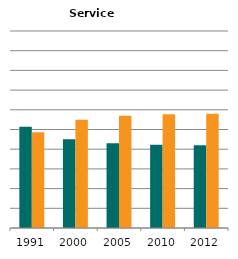
| Category | Male | Female |
|---|---|---|
| 1991.0 | 0.514 | 0.486 |
| 2000.0 | 0.451 | 0.549 |
| 2005.0 | 0.43 | 0.57 |
| 2010.0 | 0.422 | 0.578 |
| 2012.0 | 0.42 | 0.58 |